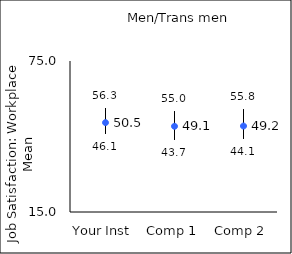
| Category | 25th percentile | 75th percentile | Mean |
|---|---|---|---|
| Your Inst | 46.1 | 56.3 | 50.52 |
| Comp 1 | 43.7 | 55 | 49.06 |
| Comp 2 | 44.1 | 55.8 | 49.16 |